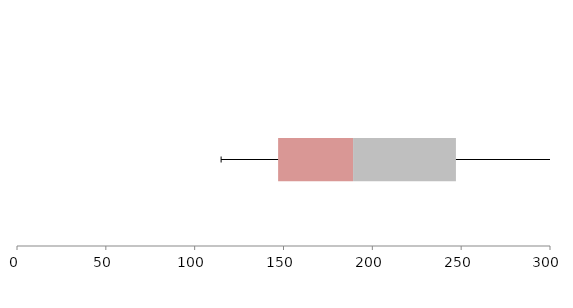
| Category | Series 1 | Series 2 | Series 3 |
|---|---|---|---|
| 0 | 146.971 | 42.191 | 57.893 |